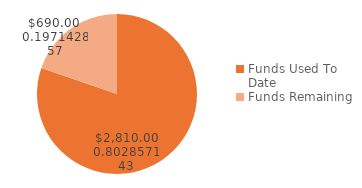
| Category | Series 0 |
|---|---|
| Funds Used To Date | 2810 |
| Funds Remaining | 690 |